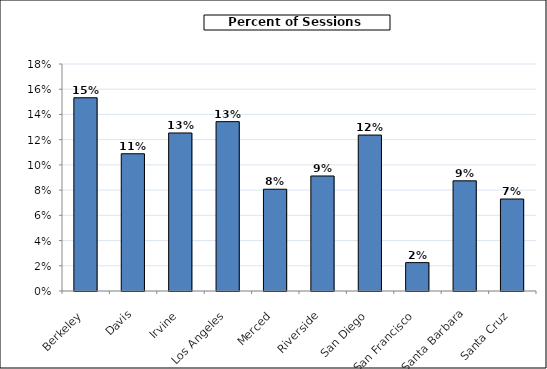
| Category | Sessions Accepted (by responding library) |
|---|---|
| Berkeley | 0.153 |
| Davis | 0.109 |
| Irvine | 0.125 |
| Los Angeles | 0.134 |
| Merced | 0.081 |
| Riverside | 0.091 |
| San Diego | 0.124 |
| San Francisco | 0.023 |
| Santa Barbara | 0.087 |
| Santa Cruz | 0.073 |